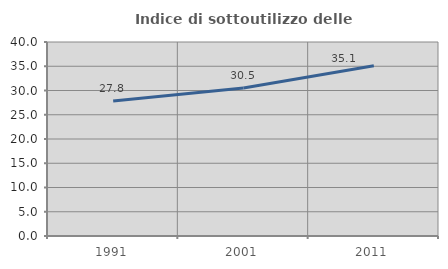
| Category | Indice di sottoutilizzo delle abitazioni  |
|---|---|
| 1991.0 | 27.83 |
| 2001.0 | 30.505 |
| 2011.0 | 35.09 |